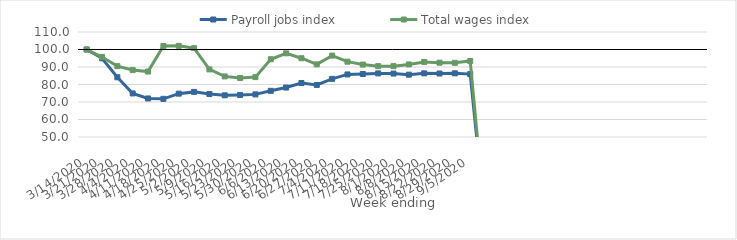
| Category | Payroll jobs index | Total wages index |
|---|---|---|
| 14/03/2020 | 100 | 100 |
| 21/03/2020 | 94.958 | 95.694 |
| 28/03/2020 | 84.124 | 90.49 |
| 04/04/2020 | 74.9 | 88.247 |
| 11/04/2020 | 72.023 | 87.399 |
| 18/04/2020 | 71.805 | 101.984 |
| 25/04/2020 | 74.777 | 102.083 |
| 02/05/2020 | 75.78 | 100.767 |
| 09/05/2020 | 74.548 | 88.629 |
| 16/05/2020 | 73.814 | 84.624 |
| 23/05/2020 | 74.043 | 83.706 |
| 30/05/2020 | 74.357 | 84.223 |
| 06/06/2020 | 76.386 | 94.426 |
| 13/06/2020 | 78.264 | 97.817 |
| 20/06/2020 | 80.848 | 95.011 |
| 27/06/2020 | 79.744 | 91.501 |
| 04/07/2020 | 83.215 | 96.525 |
| 11/07/2020 | 85.757 | 93.046 |
| 18/07/2020 | 86.007 | 91.376 |
| 25/07/2020 | 86.345 | 90.468 |
| 01/08/2020 | 86.246 | 90.491 |
| 08/08/2020 | 85.609 | 91.467 |
| 15/08/2020 | 86.374 | 92.879 |
| 22/08/2020 | 86.281 | 92.463 |
| 29/08/2020 | 86.374 | 92.376 |
| 05/09/2020 | 85.948 | 93.426 |